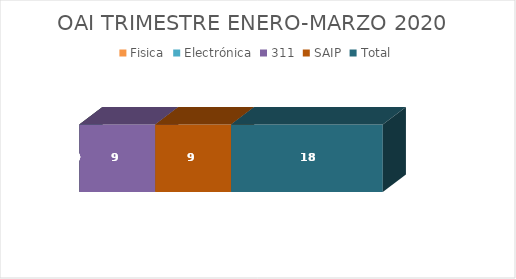
| Category | Fisica | Electrónica | 311 | SAIP | Total |
|---|---|---|---|---|---|
| 0 | 0 | 0 | 9 | 9 | 18 |